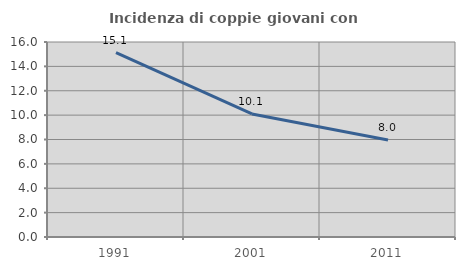
| Category | Incidenza di coppie giovani con figli |
|---|---|
| 1991.0 | 15.126 |
| 2001.0 | 10.098 |
| 2011.0 | 7.958 |